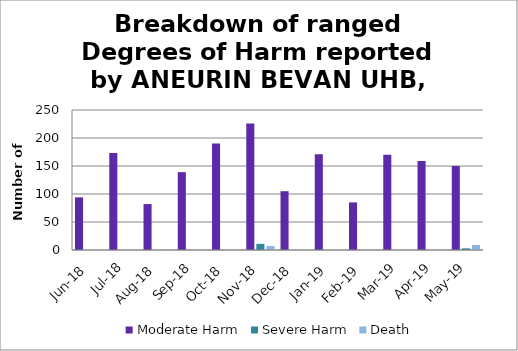
| Category | Moderate Harm | Severe Harm | Death |
|---|---|---|---|
| Jun-18 | 94 | 0 | 0 |
| Jul-18 | 173 | 0 | 0 |
| Aug-18 | 82 | 0 | 1 |
| Sep-18 | 139 | 0 | 0 |
| Oct-18 | 190 | 0 | 0 |
| Nov-18 | 226 | 11 | 7 |
| Dec-18 | 105 | 0 | 0 |
| Jan-19 | 171 | 0 | 0 |
| Feb-19 | 85 | 0 | 0 |
| Mar-19 | 170 | 0 | 0 |
| Apr-19 | 159 | 0 | 0 |
| May-19 | 150 | 3 | 9 |